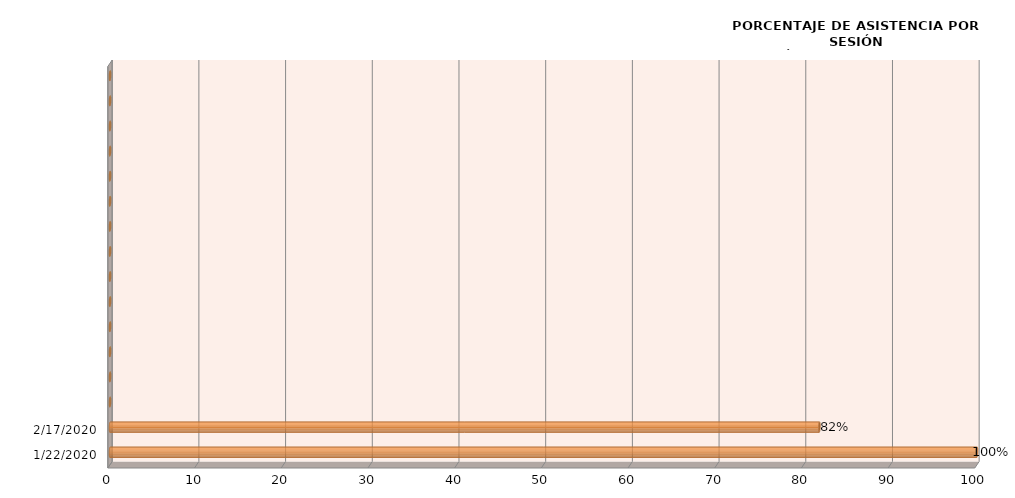
| Category | Series 0 |
|---|---|
| 1/22/20 | 100 |
| 2/17/20 | 81.818 |
| nan | 0 |
| nan | 0 |
| nan | 0 |
| nan | 0 |
| nan | 0 |
| nan | 0 |
| nan | 0 |
| nan | 0 |
| nan | 0 |
| nan | 0 |
| nan | 0 |
| nan | 0 |
| nan | 0 |
| nan | 0 |